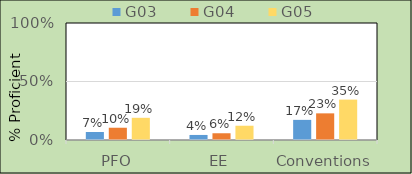
| Category | G03 | G04 | G05 |
|---|---|---|---|
| PFO | 6.827 | 10.476 | 18.966 |
| EE | 4.314 | 5.767 | 12.193 |
| Conventions | 17.203 | 22.773 | 34.521 |